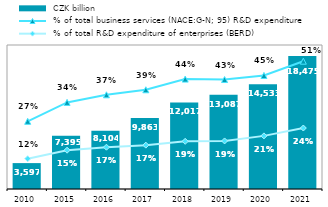
| Category |  CZK billion |
|---|---|
| 2010.0 | 3597.172 |
| 2015.0 | 7394.736 |
| 2016.0 | 8103.91 |
| 2017.0 | 9863.017 |
| 2018.0 | 12016.964 |
| 2019.0 | 13086.503 |
| 2020.0 | 14532.76 |
| 2021.0 | 18475.41 |